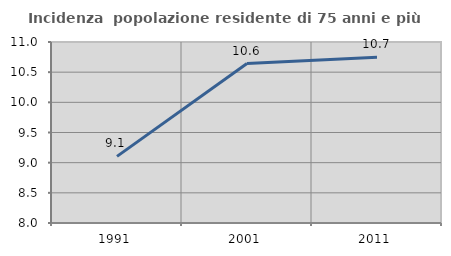
| Category | Incidenza  popolazione residente di 75 anni e più |
|---|---|
| 1991.0 | 9.104 |
| 2001.0 | 10.643 |
| 2011.0 | 10.747 |